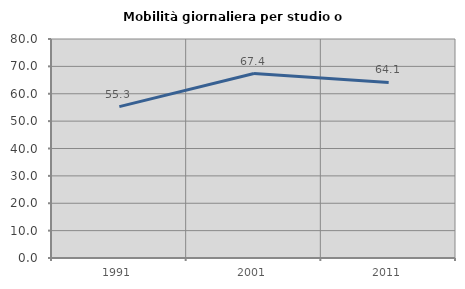
| Category | Mobilità giornaliera per studio o lavoro |
|---|---|
| 1991.0 | 55.305 |
| 2001.0 | 67.39 |
| 2011.0 | 64.111 |